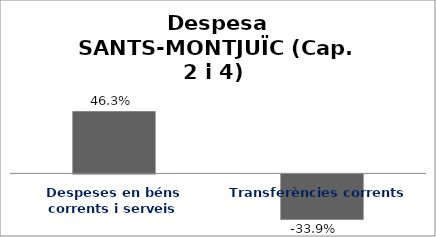
| Category | Series 0 |
|---|---|
| Despeses en béns corrents i serveis | 0.463 |
| Transferències corrents | -0.339 |